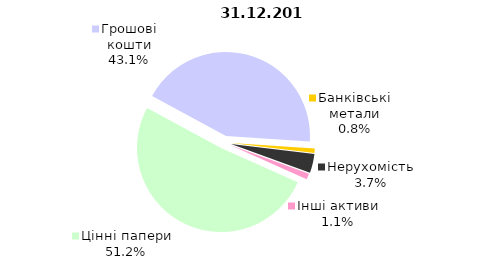
| Category | Всього |
|---|---|
| Цінні папери | 611.572 |
| Грошові кошти | 515.18 |
| Банківські метали | 10.05 |
| Нерухомість | 43.763 |
| Інші активи | 13.415 |